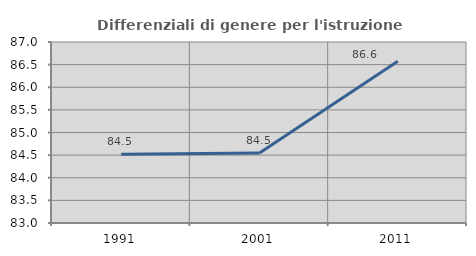
| Category | Differenziali di genere per l'istruzione superiore |
|---|---|
| 1991.0 | 84.517 |
| 2001.0 | 84.547 |
| 2011.0 | 86.577 |